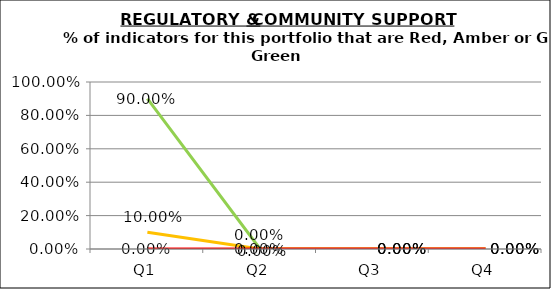
| Category | Green | Amber | Red |
|---|---|---|---|
| Q1 | 0.9 | 0.1 | 0 |
| Q2 | 0 | 0 | 0 |
| Q3 | 0 | 0 | 0 |
| Q4 | 0 | 0 | 0 |